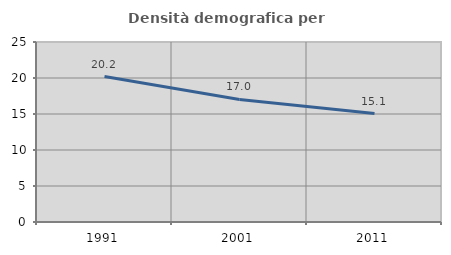
| Category | Densità demografica |
|---|---|
| 1991.0 | 20.198 |
| 2001.0 | 17.017 |
| 2011.0 | 15.064 |